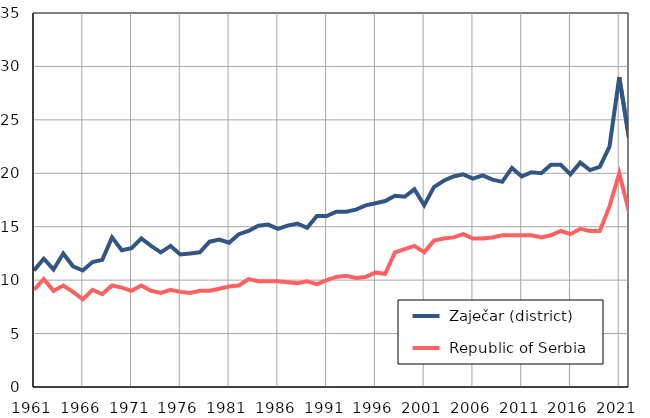
| Category |  Zaječar (district) |  Republic of Serbia |
|---|---|---|
| 1961.0 | 10.9 | 9.1 |
| 1962.0 | 12 | 10.1 |
| 1963.0 | 11 | 9 |
| 1964.0 | 12.5 | 9.5 |
| 1965.0 | 11.3 | 8.9 |
| 1966.0 | 10.9 | 8.2 |
| 1967.0 | 11.7 | 9.1 |
| 1968.0 | 11.9 | 8.7 |
| 1969.0 | 14 | 9.5 |
| 1970.0 | 12.8 | 9.3 |
| 1971.0 | 13 | 9 |
| 1972.0 | 13.9 | 9.5 |
| 1973.0 | 13.2 | 9 |
| 1974.0 | 12.6 | 8.8 |
| 1975.0 | 13.2 | 9.1 |
| 1976.0 | 12.4 | 8.9 |
| 1977.0 | 12.5 | 8.8 |
| 1978.0 | 12.6 | 9 |
| 1979.0 | 13.6 | 9 |
| 1980.0 | 13.8 | 9.2 |
| 1981.0 | 13.5 | 9.4 |
| 1982.0 | 14.3 | 9.5 |
| 1983.0 | 14.6 | 10.1 |
| 1984.0 | 15.1 | 9.9 |
| 1985.0 | 15.2 | 9.9 |
| 1986.0 | 14.8 | 9.9 |
| 1987.0 | 15.1 | 9.8 |
| 1988.0 | 15.3 | 9.7 |
| 1989.0 | 14.9 | 9.9 |
| 1990.0 | 16 | 9.6 |
| 1991.0 | 16 | 10 |
| 1992.0 | 16.4 | 10.3 |
| 1993.0 | 16.4 | 10.4 |
| 1994.0 | 16.6 | 10.2 |
| 1995.0 | 17 | 10.3 |
| 1996.0 | 17.2 | 10.7 |
| 1997.0 | 17.4 | 10.6 |
| 1998.0 | 17.9 | 12.6 |
| 1999.0 | 17.8 | 12.9 |
| 2000.0 | 18.5 | 13.2 |
| 2001.0 | 17 | 12.6 |
| 2002.0 | 18.7 | 13.7 |
| 2003.0 | 19.3 | 13.9 |
| 2004.0 | 19.7 | 14 |
| 2005.0 | 19.9 | 14.3 |
| 2006.0 | 19.5 | 13.9 |
| 2007.0 | 19.8 | 13.9 |
| 2008.0 | 19.4 | 14 |
| 2009.0 | 19.2 | 14.2 |
| 2010.0 | 20.5 | 14.2 |
| 2011.0 | 19.7 | 14.2 |
| 2012.0 | 20.1 | 14.2 |
| 2013.0 | 20 | 14 |
| 2014.0 | 20.8 | 14.2 |
| 2015.0 | 20.8 | 14.6 |
| 2016.0 | 19.9 | 14.3 |
| 2017.0 | 21 | 14.8 |
| 2018.0 | 20.3 | 14.6 |
| 2019.0 | 20.6 | 14.6 |
| 2020.0 | 22.5 | 16.9 |
| 2021.0 | 29 | 20 |
| 2022.0 | 23.3 | 16.4 |